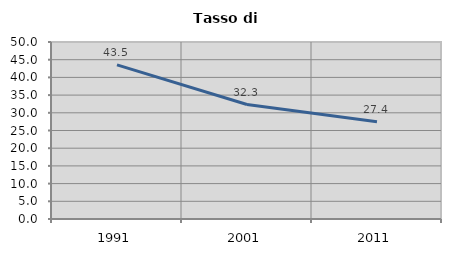
| Category | Tasso di disoccupazione   |
|---|---|
| 1991.0 | 43.53 |
| 2001.0 | 32.339 |
| 2011.0 | 27.441 |